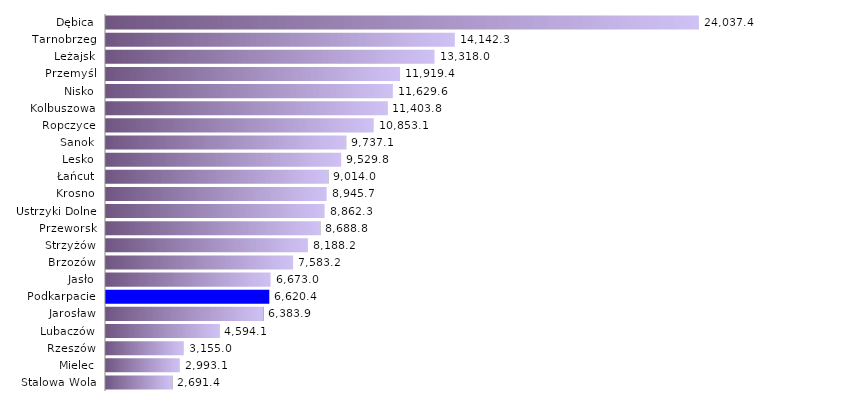
| Category | Szkolenia |
|---|---|
| Stalowa Wola | 2691.433 |
| Mielec | 2993.1 |
| Rzeszów | 3154.989 |
| Lubaczów | 4594.05 |
| Jarosław | 6383.897 |
| Podkarpacie | 6620.388 |
| Jasło | 6672.956 |
| Brzozów | 7583.248 |
| Strzyżów | 8188.185 |
| Przeworsk | 8688.789 |
| Ustrzyki Dolne | 8862.299 |
| Krosno | 8945.725 |
| Łańcut | 9013.992 |
| Lesko | 9529.808 |
| Sanok | 9737.085 |
| Ropczyce | 10853.087 |
| Kolbuszowa | 11403.811 |
| Nisko | 11629.594 |
| Przemyśl | 11919.388 |
| Leżajsk | 13318.035 |
| Tarnobrzeg | 14142.295 |
| Dębica | 24037.415 |